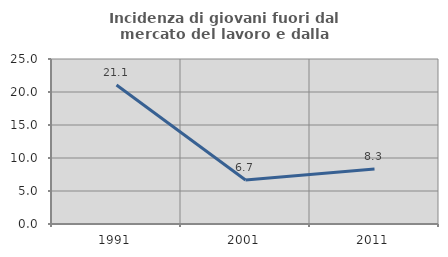
| Category | Incidenza di giovani fuori dal mercato del lavoro e dalla formazione  |
|---|---|
| 1991.0 | 21.053 |
| 2001.0 | 6.667 |
| 2011.0 | 8.333 |